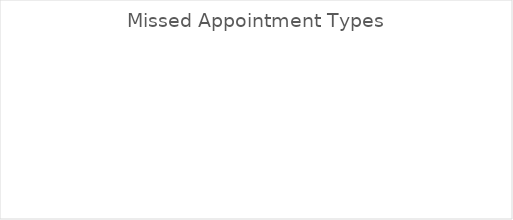
| Category | Series 0 |
|---|---|
| Subsequent Certification | 0 |
| Mid-Certification Assessment | 0 |
| Nutrition Education | 0 |
| Food Benefit Issuance | 0 |
| Breastfeeding | 0 |
| Did not have an appointment | 0 |